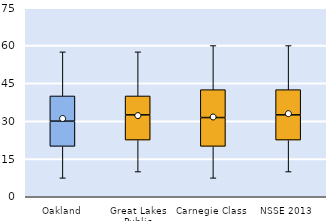
| Category | 25th | 50th | 75th |
|---|---|---|---|
| Oakland | 20 | 10 | 10 |
| Great Lakes Public | 22.5 | 10 | 7.5 |
| Carnegie Class | 20 | 11.429 | 11.071 |
| NSSE 2013 | 22.5 | 10 | 10 |